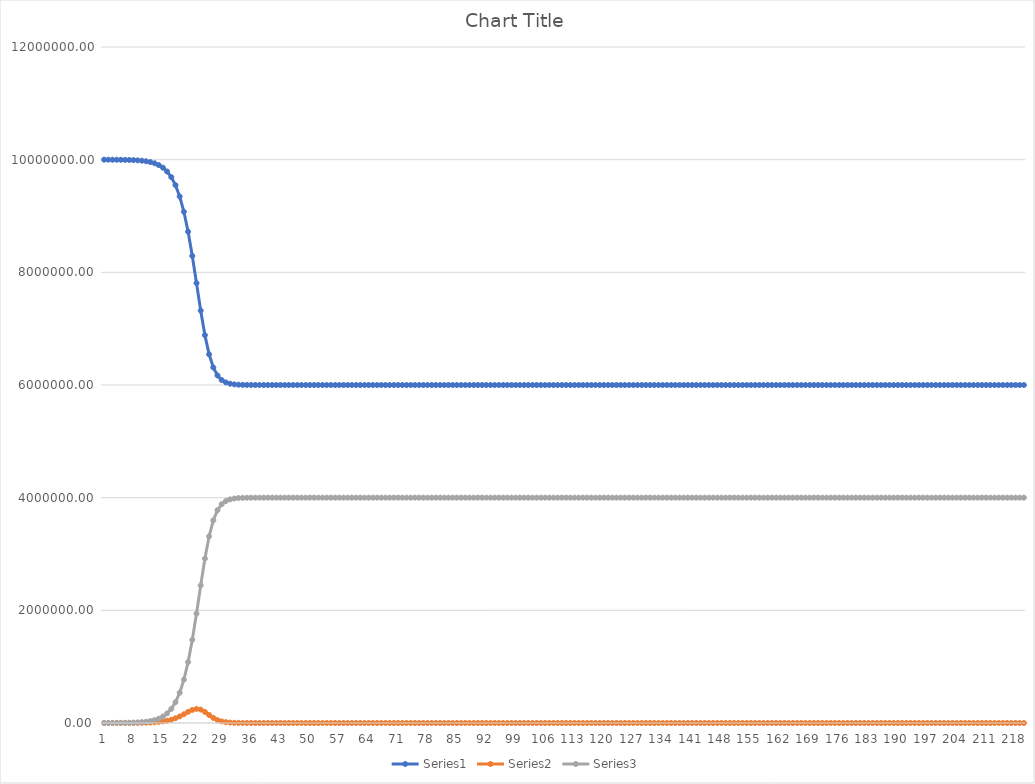
| Category | Series 0 | Series 1 | Series 2 |
|---|---|---|---|
| 0 | 9999900 | 100 | 0 |
| 1 | 9999650.002 | 149.998 | 200 |
| 2 | 9999275.022 | 224.983 | 499.995 |
| 3 | 9998712.605 | 337.434 | 949.961 |
| 4 | 9997869.129 | 506.042 | 1624.829 |
| 5 | 9996604.293 | 758.794 | 2636.914 |
| 6 | 9994707.952 | 1137.547 | 4154.501 |
| 7 | 9991865.591 | 1704.815 | 6429.594 |
| 8 | 9987607.021 | 2553.755 | 9839.224 |
| 9 | 9981230.544 | 3822.721 | 14946.735 |
| 10 | 9971691.68 | 5716.144 | 22592.177 |
| 11 | 9957441.774 | 8533.762 | 34024.464 |
| 12 | 9936198.164 | 12709.848 | 51091.988 |
| 13 | 9904626.273 | 18862.044 | 76511.683 |
| 14 | 9857920.9 | 27843.329 | 114235.771 |
| 15 | 9789301.565 | 40776.005 | 169922.429 |
| 16 | 9689509.412 | 59016.148 | 251474.44 |
| 17 | 9546550.032 | 83943.232 | 369506.736 |
| 18 | 9346207.965 | 116398.834 | 537393.2 |
| 19 | 9074236.037 | 155573.094 | 770190.869 |
| 20 | 8721309.294 | 197353.65 | 1081337.057 |
| 21 | 8291013.739 | 232941.905 | 1476044.356 |
| 22 | 7808182.605 | 249889.229 | 1941928.167 |
| 23 | 7320387.422 | 237905.954 | 2441706.624 |
| 24 | 6884996.484 | 197484.984 | 2917518.532 |
| 25 | 6545075.629 | 142435.871 | 3312488.5 |
| 26 | 6312012.242 | 90627.516 | 3597360.242 |
| 27 | 6169001.744 | 52382.982 | 3778615.274 |
| 28 | 6088214.068 | 28404.695 | 3883381.237 |
| 29 | 6044980.603 | 14828.771 | 3940190.627 |
| 30 | 6022570.695 | 7581.137 | 3969848.168 |
| 31 | 6011156.211 | 3833.346 | 3985010.442 |
| 32 | 6005395.5 | 1927.365 | 3992677.135 |
| 33 | 6002501.853 | 966.282 | 3996531.865 |
| 34 | 6001051.826 | 483.745 | 3998464.429 |
| 35 | 6000326.08 | 242 | 3999431.92 |
| 36 | 5999963.061 | 121.02 | 3999915.919 |
| 37 | 5999781.532 | 60.509 | 4000157.959 |
| 38 | 5999690.773 | 30.251 | 4000278.976 |
| 39 | 5999645.398 | 15.123 | 4000339.478 |
| 40 | 5999622.715 | 7.56 | 4000369.725 |
| 41 | 5999611.375 | 3.779 | 4000384.845 |
| 42 | 5999605.707 | 1.889 | 4000392.404 |
| 43 | 5999602.873 | 0.944 | 4000396.183 |
| 44 | 5999601.456 | 0.472 | 4000398.072 |
| 45 | 5999600.748 | 0.236 | 4000399.016 |
| 46 | 5999600.394 | 0.118 | 4000399.488 |
| 47 | 5999600.217 | 0.059 | 4000399.724 |
| 48 | 5999600.128 | 0.029 | 4000399.842 |
| 49 | 5999600.084 | 0.015 | 4000399.901 |
| 50 | 5999600.062 | 0.007 | 4000399.931 |
| 51 | 5999600.051 | 0.004 | 4000399.945 |
| 52 | 5999600.046 | 0.002 | 4000399.953 |
| 53 | 5999600.043 | 0.001 | 4000399.956 |
| 54 | 5999600.041 | 0 | 4000399.958 |
| 55 | 5999600.041 | 0 | 4000399.959 |
| 56 | 5999600.04 | 0 | 4000399.96 |
| 57 | 5999600.04 | 0 | 4000399.96 |
| 58 | 5999600.04 | 0 | 4000399.96 |
| 59 | 5999600.04 | 0 | 4000399.96 |
| 60 | 5999600.04 | 0 | 4000399.96 |
| 61 | 5999600.04 | 0 | 4000399.96 |
| 62 | 5999600.04 | 0 | 4000399.96 |
| 63 | 5999600.04 | 0 | 4000399.96 |
| 64 | 5999600.04 | 0 | 4000399.96 |
| 65 | 5999600.04 | 0 | 4000399.96 |
| 66 | 5999600.04 | 0 | 4000399.96 |
| 67 | 5999600.04 | 0 | 4000399.96 |
| 68 | 5999600.04 | 0 | 4000399.96 |
| 69 | 5999600.04 | 0 | 4000399.96 |
| 70 | 5999600.04 | 0 | 4000399.96 |
| 71 | 5999600.04 | 0 | 4000399.96 |
| 72 | 5999600.04 | 0 | 4000399.96 |
| 73 | 5999600.04 | 0 | 4000399.96 |
| 74 | 5999600.04 | 0 | 4000399.96 |
| 75 | 5999600.04 | 0 | 4000399.96 |
| 76 | 5999600.04 | 0 | 4000399.96 |
| 77 | 5999600.04 | 0 | 4000399.96 |
| 78 | 5999600.04 | 0 | 4000399.96 |
| 79 | 5999600.04 | 0 | 4000399.96 |
| 80 | 5999600.04 | 0 | 4000399.96 |
| 81 | 5999600.04 | 0 | 4000399.96 |
| 82 | 5999600.04 | 0 | 4000399.96 |
| 83 | 5999600.04 | 0 | 4000399.96 |
| 84 | 5999600.04 | 0 | 4000399.96 |
| 85 | 5999600.04 | 0 | 4000399.96 |
| 86 | 5999600.04 | 0 | 4000399.96 |
| 87 | 5999600.04 | 0 | 4000399.96 |
| 88 | 5999600.04 | 0 | 4000399.96 |
| 89 | 5999600.04 | 0 | 4000399.96 |
| 90 | 5999600.04 | 0 | 4000399.96 |
| 91 | 5999600.04 | 0 | 4000399.96 |
| 92 | 5999600.04 | 0 | 4000399.96 |
| 93 | 5999600.04 | 0 | 4000399.96 |
| 94 | 5999600.04 | 0 | 4000399.96 |
| 95 | 5999600.04 | 0 | 4000399.96 |
| 96 | 5999600.04 | 0 | 4000399.96 |
| 97 | 5999600.04 | 0 | 4000399.96 |
| 98 | 5999600.04 | 0 | 4000399.96 |
| 99 | 5999600.04 | 0 | 4000399.96 |
| 100 | 5999600.04 | 0 | 4000399.96 |
| 101 | 5999600.04 | 0 | 4000399.96 |
| 102 | 5999600.04 | 0 | 4000399.96 |
| 103 | 5999600.04 | 0 | 4000399.96 |
| 104 | 5999600.04 | 0 | 4000399.96 |
| 105 | 5999600.04 | 0 | 4000399.96 |
| 106 | 5999600.04 | 0 | 4000399.96 |
| 107 | 5999600.04 | 0 | 4000399.96 |
| 108 | 5999600.04 | 0 | 4000399.96 |
| 109 | 5999600.04 | 0 | 4000399.96 |
| 110 | 5999600.04 | 0 | 4000399.96 |
| 111 | 5999600.04 | 0 | 4000399.96 |
| 112 | 5999600.04 | 0 | 4000399.96 |
| 113 | 5999600.04 | 0 | 4000399.96 |
| 114 | 5999600.04 | 0 | 4000399.96 |
| 115 | 5999600.04 | 0 | 4000399.96 |
| 116 | 5999600.04 | 0 | 4000399.96 |
| 117 | 5999600.04 | 0 | 4000399.96 |
| 118 | 5999600.04 | 0 | 4000399.96 |
| 119 | 5999600.04 | 0 | 4000399.96 |
| 120 | 5999600.04 | 0 | 4000399.96 |
| 121 | 5999600.04 | 0 | 4000399.96 |
| 122 | 5999600.04 | 0 | 4000399.96 |
| 123 | 5999600.04 | 0 | 4000399.96 |
| 124 | 5999600.04 | 0 | 4000399.96 |
| 125 | 5999600.04 | 0 | 4000399.96 |
| 126 | 5999600.04 | 0 | 4000399.96 |
| 127 | 5999600.04 | 0 | 4000399.96 |
| 128 | 5999600.04 | 0 | 4000399.96 |
| 129 | 5999600.04 | 0 | 4000399.96 |
| 130 | 5999600.04 | 0 | 4000399.96 |
| 131 | 5999600.04 | 0 | 4000399.96 |
| 132 | 5999600.04 | 0 | 4000399.96 |
| 133 | 5999600.04 | 0 | 4000399.96 |
| 134 | 5999600.04 | 0 | 4000399.96 |
| 135 | 5999600.04 | 0 | 4000399.96 |
| 136 | 5999600.04 | 0 | 4000399.96 |
| 137 | 5999600.04 | 0 | 4000399.96 |
| 138 | 5999600.04 | 0 | 4000399.96 |
| 139 | 5999600.04 | 0 | 4000399.96 |
| 140 | 5999600.04 | 0 | 4000399.96 |
| 141 | 5999600.04 | 0 | 4000399.96 |
| 142 | 5999600.04 | 0 | 4000399.96 |
| 143 | 5999600.04 | 0 | 4000399.96 |
| 144 | 5999600.04 | 0 | 4000399.96 |
| 145 | 5999600.04 | 0 | 4000399.96 |
| 146 | 5999600.04 | 0 | 4000399.96 |
| 147 | 5999600.04 | 0 | 4000399.96 |
| 148 | 5999600.04 | 0 | 4000399.96 |
| 149 | 5999600.04 | 0 | 4000399.96 |
| 150 | 5999600.04 | 0 | 4000399.96 |
| 151 | 5999600.04 | 0 | 4000399.96 |
| 152 | 5999600.04 | 0 | 4000399.96 |
| 153 | 5999600.04 | 0 | 4000399.96 |
| 154 | 5999600.04 | 0 | 4000399.96 |
| 155 | 5999600.04 | 0 | 4000399.96 |
| 156 | 5999600.04 | 0 | 4000399.96 |
| 157 | 5999600.04 | 0 | 4000399.96 |
| 158 | 5999600.04 | 0 | 4000399.96 |
| 159 | 5999600.04 | 0 | 4000399.96 |
| 160 | 5999600.04 | 0 | 4000399.96 |
| 161 | 5999600.04 | 0 | 4000399.96 |
| 162 | 5999600.04 | 0 | 4000399.96 |
| 163 | 5999600.04 | 0 | 4000399.96 |
| 164 | 5999600.04 | 0 | 4000399.96 |
| 165 | 5999600.04 | 0 | 4000399.96 |
| 166 | 5999600.04 | 0 | 4000399.96 |
| 167 | 5999600.04 | 0 | 4000399.96 |
| 168 | 5999600.04 | 0 | 4000399.96 |
| 169 | 5999600.04 | 0 | 4000399.96 |
| 170 | 5999600.04 | 0 | 4000399.96 |
| 171 | 5999600.04 | 0 | 4000399.96 |
| 172 | 5999600.04 | 0 | 4000399.96 |
| 173 | 5999600.04 | 0 | 4000399.96 |
| 174 | 5999600.04 | 0 | 4000399.96 |
| 175 | 5999600.04 | 0 | 4000399.96 |
| 176 | 5999600.04 | 0 | 4000399.96 |
| 177 | 5999600.04 | 0 | 4000399.96 |
| 178 | 5999600.04 | 0 | 4000399.96 |
| 179 | 5999600.04 | 0 | 4000399.96 |
| 180 | 5999600.04 | 0 | 4000399.96 |
| 181 | 5999600.04 | 0 | 4000399.96 |
| 182 | 5999600.04 | 0 | 4000399.96 |
| 183 | 5999600.04 | 0 | 4000399.96 |
| 184 | 5999600.04 | 0 | 4000399.96 |
| 185 | 5999600.04 | 0 | 4000399.96 |
| 186 | 5999600.04 | 0 | 4000399.96 |
| 187 | 5999600.04 | 0 | 4000399.96 |
| 188 | 5999600.04 | 0 | 4000399.96 |
| 189 | 5999600.04 | 0 | 4000399.96 |
| 190 | 5999600.04 | 0 | 4000399.96 |
| 191 | 5999600.04 | 0 | 4000399.96 |
| 192 | 5999600.04 | 0 | 4000399.96 |
| 193 | 5999600.04 | 0 | 4000399.96 |
| 194 | 5999600.04 | 0 | 4000399.96 |
| 195 | 5999600.04 | 0 | 4000399.96 |
| 196 | 5999600.04 | 0 | 4000399.96 |
| 197 | 5999600.04 | 0 | 4000399.96 |
| 198 | 5999600.04 | 0 | 4000399.96 |
| 199 | 5999600.04 | 0 | 4000399.96 |
| 200 | 5999600.04 | 0 | 4000399.96 |
| 201 | 5999600.04 | 0 | 4000399.96 |
| 202 | 5999600.04 | 0 | 4000399.96 |
| 203 | 5999600.04 | 0 | 4000399.96 |
| 204 | 5999600.04 | 0 | 4000399.96 |
| 205 | 5999600.04 | 0 | 4000399.96 |
| 206 | 5999600.04 | 0 | 4000399.96 |
| 207 | 5999600.04 | 0 | 4000399.96 |
| 208 | 5999600.04 | 0 | 4000399.96 |
| 209 | 5999600.04 | 0 | 4000399.96 |
| 210 | 5999600.04 | 0 | 4000399.96 |
| 211 | 5999600.04 | 0 | 4000399.96 |
| 212 | 5999600.04 | 0 | 4000399.96 |
| 213 | 5999600.04 | 0 | 4000399.96 |
| 214 | 5999600.04 | 0 | 4000399.96 |
| 215 | 5999600.04 | 0 | 4000399.96 |
| 216 | 5999600.04 | 0 | 4000399.96 |
| 217 | 5999600.04 | 0 | 4000399.96 |
| 218 | 5999600.04 | 0 | 4000399.96 |
| 219 | 5999600.04 | 0 | 4000399.96 |